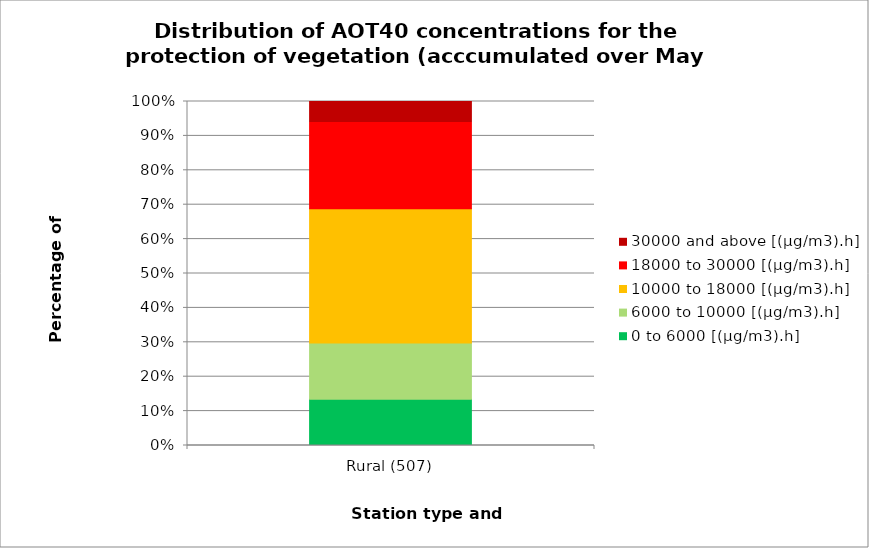
| Category | 0 to 6000 [(µg/m3).h] | 6000 to 10000 [(µg/m3).h] | 10000 to 18000 [(µg/m3).h] | 18000 to 30000 [(µg/m3).h] | 30000 and above [(µg/m3).h] |
|---|---|---|---|---|---|
| Rural (507) | 0.134 | 0.164 | 0.391 | 0.25 | 0.061 |